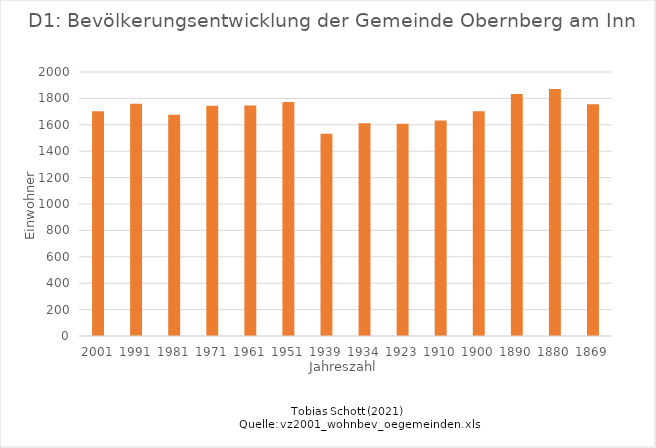
| Category | Einwohner |
|---|---|
| 2001.0 | 1703 |
| 1991.0 | 1759 |
| 1981.0 | 1677 |
| 1971.0 | 1744 |
| 1961.0 | 1746 |
| 1951.0 | 1772 |
| 1939.0 | 1532 |
| 1934.0 | 1611 |
| 1923.0 | 1608 |
| 1910.0 | 1632 |
| 1900.0 | 1702 |
| 1890.0 | 1834 |
| 1880.0 | 1871 |
| 1869.0 | 1755 |